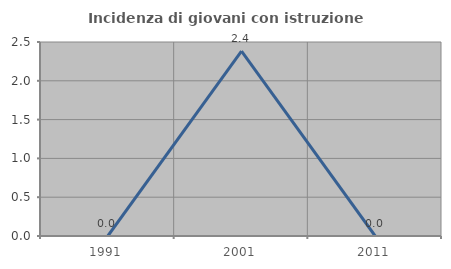
| Category | Incidenza di giovani con istruzione universitaria |
|---|---|
| 1991.0 | 0 |
| 2001.0 | 2.381 |
| 2011.0 | 0 |